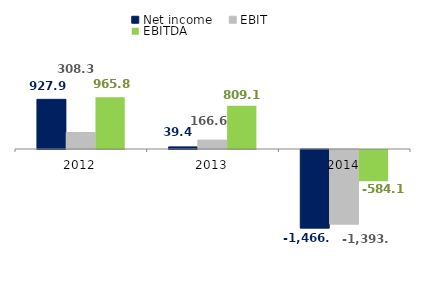
| Category | Net income | EBIT | EBITDA |
|---|---|---|---|
| 2012 | 927.9 | 308.3 | 965.8 |
| 2013 | 39.4 | 166.6 | 809.1 |
| 2014 | -1466.4 | -1393 | -584.1 |